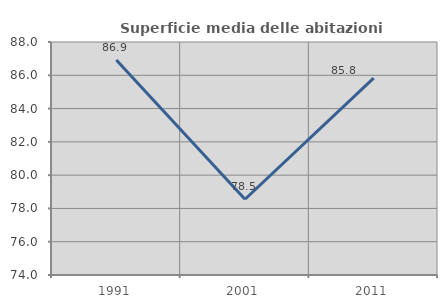
| Category | Superficie media delle abitazioni occupate |
|---|---|
| 1991.0 | 86.912 |
| 2001.0 | 78.55 |
| 2011.0 | 85.833 |